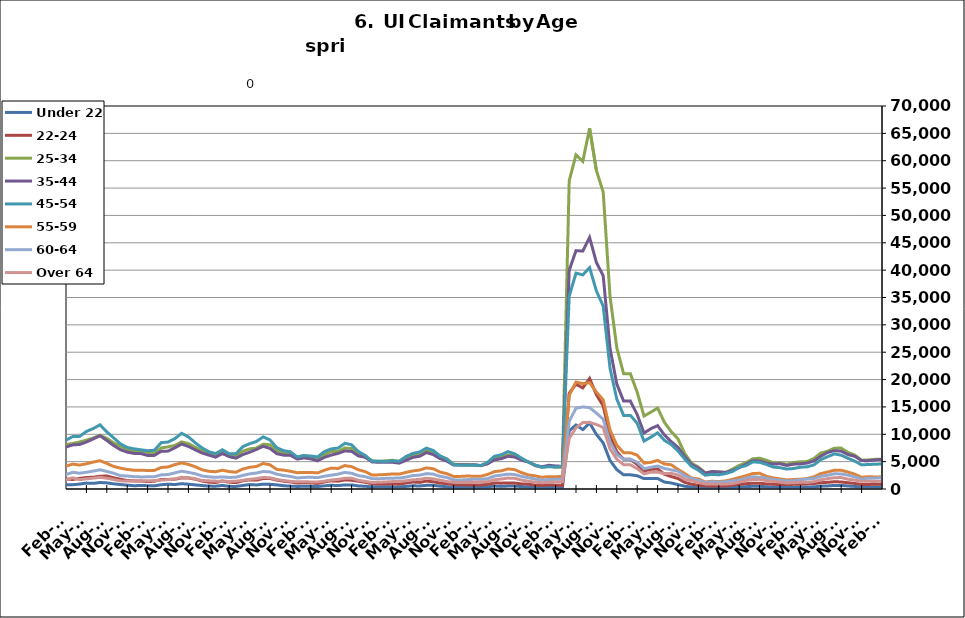
| Category | Under 22 | 22-24 | 25-34 | 35-44 | 45-54 | 55-59 | 60-64 | Over 64 |
|---|---|---|---|---|---|---|---|---|
| 1995-02-28 | 535 | 933 | 5740 | 6206 | 4029 | 1255 | 625 | 276 |
| 1995-03-31 | 534 | 992 | 5856 | 6433 | 4297 | 1294 | 686 | 323 |
| 1995-04-30 | 603 | 1125 | 6814 | 6965 | 4447 | 1392 | 730 | 338 |
| 1995-05-31 | 626 | 1171 | 7442 | 7404 | 4702 | 1383 | 751 | 333 |
| 1995-06-30 | 625 | 1218 | 7514 | 7778 | 4867 | 1435 | 813 | 366 |
| 1995-07-31 | 710 | 1296 | 8612 | 8864 | 5537 | 1595 | 891 | 407 |
| 1995-08-31 | 729 | 1248 | 8185 | 8719 | 5400 | 1604 | 982 | 406 |
| 1995-09-30 | 578 | 1028 | 6615 | 7150 | 4534 | 1351 | 862 | 338 |
| 1995-10-31 | 554 | 957 | 5805 | 6461 | 4159 | 1205 | 741 | 287 |
| 1995-11-30 | 468 | 845 | 5201 | 5826 | 3927 | 1155 | 702 | 254 |
| 1995-12-31 | 517 | 858 | 5350 | 5974 | 4010 | 1153 | 672 | 263 |
| 1996-01-31 | 543 | 927 | 5431 | 6086 | 4208 | 1221 | 685 | 301 |
| 1996-02-29 | 617 | 999 | 5667 | 6535 | 4480 | 1312 | 747 | 305 |
| 1996-03-31 | 622 | 981 | 5896 | 6557 | 4514 | 1362 | 763 | 306 |
| 1996-04-30 | 680 | 1140 | 7032 | 7649 | 5088 | 1527 | 856 | 345 |
| 1996-05-31 | 689 | 1163 | 7220 | 7819 | 5070 | 1521 | 832 | 366 |
| 1996-06-30 | 661 | 1145 | 7344 | 8173 | 5391 | 1568 | 844 | 388 |
| 1996-07-31 | 762 | 1250 | 8375 | 9181 | 6036 | 1755 | 973 | 432 |
| 1996-08-31 | 746 | 1145 | 7829 | 8585 | 5586 | 1651 | 950 | 435 |
| 1996-09-30 | 635 | 992 | 6399 | 7097 | 4790 | 1462 | 804 | 425 |
| 1996-10-31 | 572 | 851 | 5448 | 6291 | 4192 | 1259 | 693 | 340 |
| 1996-11-30 | 531 | 827 | 5003 | 5921 | 3908 | 1153 | 602 | 315 |
| 1996-12-31 | 521 | 789 | 4710 | 5510 | 3673 | 1110 | 610 | 284 |
| 1997-01-31 | 559 | 841 | 5203 | 6172 | 4321 | 1255 | 731 | 328 |
| 1997-02-28 | 556 | 841 | 5187 | 6162 | 4311 | 1250 | 727 | 326 |
| 1997-03-31 | 499 | 806 | 5125 | 6037 | 4176 | 1294 | 702 | 363 |
| 1997-04-30 | 545 | 885 | 5753 | 6709 | 4248 | 1339 | 734 | 339 |
| 1997-05-31 | 612 | 941 | 6146 | 7153 | 4458 | 1348 | 801 | 336 |
| 1997-06-30 | 623 | 995 | 6240 | 7298 | 4662 | 1302 | 776 | 348 |
| 1997-07-31 | 716 | 1154 | 7168 | 8554 | 5489 | 1509 | 903 | 415 |
| 1997-08-31 | 684 | 1072 | 6853 | 8093 | 5222 | 1487 | 837 | 416 |
| 1997-09-30 | 579 | 912 | 5522 | 6592 | 4348 | 1285 | 705 | 380 |
| 1997-10-31 | 516 | 817 | 4894.5 | 5892.5 | 3945 | 1159 | 625 | 344.5 |
| 1997-11-30 | 453 | 722 | 4267 | 5193 | 3542 | 1033 | 545 | 309 |
| 1997-12-31 | 413 | 682 | 3792 | 4755 | 3300 | 1023 | 490 | 266 |
| 1998-01-31 | 489 | 741 | 4044 | 5115 | 3513 | 1099 | 525 | 267 |
| 1998-02-28 | 435 | 684 | 3864 | 4903 | 3549 | 1043 | 571 | 285 |
| 1998-03-31 | 416 | 680 | 3855 | 5086 | 3703 | 1176 | 604 | 297 |
| 1998-04-30 | 592 | 813 | 5092 | 6219 | 4262 | 1336 | 688 | 332 |
| 1998-05-31 | 579 | 849 | 5319 | 6766 | 4554 | 1382 | 729 | 360 |
| 1998-06-30 | 568 | 899 | 5557 | 7101 | 4897 | 1405 | 783 | 367 |
| 1998-07-31 | 691 | 1031 | 6472 | 8095 | 5562 | 1589 | 880 | 392 |
| 1998-08-31 | 673 | 1007 | 6326 | 7950 | 5369 | 1574 | 935 | 393 |
| 1998-09-30 | 548 | 838 | 5206 | 6768 | 4703 | 1432 | 849 | 373 |
| 1998-10-31 | 496 | 776 | 4437 | 5582 | 3875 | 1250 | 711 | 302 |
| 1998-11-30 | 456 | 761 | 4182 | 5332 | 4015 | 1296 | 694 | 308 |
| 1998-12-31 | 442 | 722 | 4010 | 5198 | 4062 | 1331 | 656 | 290 |
| 1999-01-31 | 503 | 830 | 4502 | 5761 | 4521 | 1490 | 751 | 297 |
| 1999-02-28 | 463 | 756 | 4267 | 5576 | 4431 | 1470 | 767 | 301 |
| 1999-03-31 | 435 | 688 | 4119 | 5519 | 4403 | 1516 | 765 | 331 |
| 1999-04-30 | 591 | 949 | 5292 | 7089 | 5468 | 1724 | 914 | 489 |
| 1999-05-31 | 674 | 911 | 5611 | 7459 | 5457 | 1710 | 934 | 500 |
| 1999-06-30 | 640 | 906 | 5660 | 7503 | 5333 | 1695 | 920 | 495 |
| 1999-07-31 | 766 | 1132 | 6820 | 9256 | 6620 | 1981 | 1001 | 549 |
| 1999-08-31 | 738 | 1117 | 6737 | 9030 | 6670 | 2019 | 1075 | 582 |
| 1999-09-30 | 600 | 968 | 5167 | 7169 | 5458 | 1712 | 892 | 465 |
| 1999-10-31 | 494 | 813 | 4501 | 6048 | 4682 | 1443 | 743 | 363 |
| 1999-11-30 | 464 | 768 | 4228 | 5593 | 4564 | 1392 | 702 | 313 |
| 1999-12-31 | 468.5 | 754.5 | 4149 | 5486.5 | 4505 | 1429 | 673 | 304 |
| 2000-01-31 | 473 | 741 | 4070 | 5380 | 4446 | 1466 | 644 | 295 |
| 2000-02-29 | 460 | 691 | 3807 | 5357 | 4470 | 1469 | 707 | 310 |
| 2000-03-31 | 412 | 652 | 3864 | 5499 | 4568 | 1508 | 816 | 389 |
| 2000-04-30 | 585 | 829 | 4741 | 6891 | 5127 | 1631 | 906 | 451 |
| 2000-05-31 | 627 | 875 | 5086 | 7211 | 5238 | 1598 | 956 | 489 |
| 2000-06-30 | 675 | 983 | 5624 | 7826 | 5562 | 1669 | 941 | 524 |
| 2000-07-31 | 802 | 1109 | 6475 | 9102 | 6450 | 1927 | 1097 | 594 |
| 2000-08-31 | 787 | 1058 | 6045 | 8732 | 6157 | 1894 | 1085 | 616 |
| 2000-09-30 | 607 | 897 | 4766 | 6864 | 5037 | 1486 | 902 | 479 |
| 2000-10-31 | 544 | 760 | 4267 | 5897 | 4465 | 1323 | 762 | 394 |
| 2000-11-30 | 535 | 797 | 3982 | 5439 | 4318 | 1256 | 702 | 396 |
| 2000-12-31 | 508 | 832 | 3891 | 5255 | 4218 | 1246 | 694 | 361 |
| 2001-01-31 | 627 | 892 | 4229 | 5724 | 4777 | 1300 | 721 | 393 |
| 2001-02-28 | 643 | 934 | 4553 | 6302 | 5224 | 1529 | 849 | 472 |
| 2001-03-31 | 412 | 648 | 3625 | 5081 | 4551 | 1413 | 778 | 440 |
| 2001-04-30 | 875 | 1276 | 6577 | 8914 | 7196 | 2144 | 1185 | 639 |
| 2001-05-31 | 944 | 1399 | 7133 | 9570 | 7651 | 2265 | 1231 | 679 |
| 2001-06-30 | 1041 | 1584 | 8072 | 11034 | 8621 | 2613 | 1398 | 756 |
| 2001-07-31 | 1135 | 1806 | 9038 | 12514 | 9691 | 2970 | 1611 | 848 |
| 2001-08-31 | 1116 | 1776 | 8753 | 12045 | 9560 | 2963 | 1691 | 898 |
| 2001-09-30 | 1046 | 1705 | 8118 | 11025 | 8788 | 2784 | 1608 | 833 |
| 2001-10-31 | 1094 | 1785 | 8459 | 11114 | 8850 | 2772 | 1610 | 777 |
| 2001-11-30 | 1154 | 1931 | 9131 | 11576 | 9447 | 2973 | 1661 | 778 |
| 2001-12-31 | 1280 | 2191 | 9917 | 11961 | 9905 | 3152 | 1740 | 780 |
| 2002-01-31 | 1330 | 2255 | 10364 | 12730 | 10592 | 3378 | 1843 | 821 |
| 2002-02-28 | 1347 | 2339 | 10349 | 12730 | 10784 | 3499 | 1861 | 867 |
| 2002-03-31 | 1266 | 2231 | 9963 | 12747 | 10614 | 3499 | 1867 | 979 |
| 2002-04-30 | 1412 | 2488 | 11603 | 15825 | 13571 | 4631 | 2389 | 1146 |
| 2002-05-31 | 1455 | 2421 | 11243 | 15509 | 13148 | 4374 | 2359 | 1195 |
| 2002-06-30 | 1534 | 2479 | 11416 | 15594 | 13261 | 4343 | 2365 | 1180 |
| 2002-07-31 | 1513 | 2614 | 11895 | 16242 | 13727 | 4439 | 2428 | 1255 |
| 2002-08-31 | 1022 | 1977 | 8719 | 12054 | 10588 | 3454 | 1990 | 1047 |
| 2002-09-30 | 1391 | 2528 | 10478 | 14010 | 12008 | 3847 | 2161 | 1166 |
| 2002-10-31 | 1401 | 2385 | 9826 | 12727 | 10778 | 3498 | 1886 | 973 |
| 2002-11-30 | 1344 | 2390 | 9846 | 12059 | 10297 | 3367 | 1833 | 958 |
| 2002-12-31 | 1311 | 2403 | 9841 | 11670 | 10177 | 3369 | 1871 | 894 |
| 2003-01-31 | 1311 | 2403 | 9841 | 11670 | 10177 | 3369 | 1871 | 894 |
| 2003-02-28 | 1367 | 2275 | 9730 | 12433 | 10806 | 3687 | 2016 | 974 |
| 2003-03-31 | 1367 | 2357 | 9844 | 12620 | 11167 | 3825 | 2151 | 1094 |
| 2003-04-30 | 1549 | 2525 | 10619 | 14142 | 12182 | 4004 | 2304 | 1190 |
| 2003-05-31 | 1663 | 2698 | 10843 | 14795 | 12539 | 4102 | 2395 | 1256 |
| 2003-06-30 | 1755 | 2770 | 11350 | 15575 | 13251 | 4301 | 2493 | 1325 |
| 2003-07-31 | 1748 | 2791 | 11577 | 15863 | 13772 | 4465 | 2593 | 1371 |
| 2003-08-31 | 1718 | 2653 | 10998 | 15261 | 13219 | 4325 | 2522 | 1359 |
| 2003-09-30 | 1494 | 2521 | 10071 | 13565 | 11659 | 3828 | 2278 | 1286 |
| 2003-10-31 | 1329 | 2432 | 9388 | 12107 | 10693 | 3567 | 2036 | 1129 |
| 2003-11-30 | 1191 | 2226 | 8954 | 11297 | 10037 | 3414 | 2004 | 1068 |
| 2003-12-31 | 1206 | 2184 | 8530 | 10413 | 9335 | 3215 | 1854 | 994 |
| 2004-01-31 | 1216 | 2171 | 8382 | 9858 | 8955 | 2992 | 1736 | 963 |
| 2004-02-29 | 1118 | 1879 | 7614 | 8935 | 8176 | 2761 | 1617 | 943 |
| 2004-03-31 | 1099 | 1749 | 7152 | 8565 | 7769 | 2686 | 1608 | 981 |
| 2004-04-30 | 1241 | 1951 | 7653 | 9981 | 8741 | 2872 | 1685 | 1056 |
| 2004-05-31 | 1245 | 1934 | 7651 | 10203 | 8820 | 2928 | 1703 | 1079 |
| 2004-06-30 | 1316 | 2086 | 8172 | 10636 | 9362 | 3146 | 1843 | 1081 |
| 2004-07-31 | 1476 | 2265 | 8795 | 11511 | 10439 | 3497 | 2008 | 1171 |
| 2004-08-31 | 1390 | 2055 | 8008 | 10418 | 9514 | 3304 | 1909 | 1105 |
| 2004-09-30 | 1129 | 1820 | 6987 | 8661 | 7694 | 2755 | 1623 | 1046 |
| 2004-10-31 | 1037 | 1675 | 6590 | 7964 | 7029 | 2459 | 1461 | 882 |
| 2004-11-30 | 954 | 1638 | 6342 | 7570 | 6733 | 2294 | 1383 | 841 |
| 2004-12-31 | 857 | 1533 | 5921 | 6991 | 6333 | 2225 | 1287 | 764 |
| 2005-01-31 | 893 | 1539 | 6047 | 7410 | 6682 | 2253 | 1274 | 788 |
| 2005-02-28 | 846 | 1361 | 5650 | 6952 | 6404 | 2198 | 1326 | 786 |
| 2005-03-31 | 747 | 1258 | 5313 | 6595 | 6251 | 2151 | 1327 | 742 |
| 2005-04-30 | 877 | 1375 | 5696 | 7717 | 7230 | 2440 | 1401 | 844 |
| 2005-05-31 | 854 | 1408 | 5674 | 7905 | 7454 | 2482 | 1453 | 858 |
| 2005-06-30 | 819 | 1444 | 6028 | 8565 | 7899 | 2613 | 1547 | 890 |
| 2005-07-31 | 900 | 1461 | 6395 | 9124 | 8614 | 2864 | 1640 | 1004 |
| 2005-08-31 | 805 | 1439 | 5917 | 8271 | 8076 | 2692 | 1587 | 945 |
| 2005-09-30 | 631 | 1209 | 4978 | 6413 | 6203 | 2116 | 1312 | 724 |
| 2005-10-31 | 638 | 1134 | 4602 | 6028 | 5688 | 1997 | 1171 | 656 |
| 2005-11-30 | 564 | 1071 | 4409 | 5563 | 5105 | 1791 | 1035 | 580 |
| 2005-12-31 | 523 | 987 | 4014 | 4983 | 4531 | 1673 | 968 | 546 |
| 2006-01-31 | 531 | 925 | 3900 | 5012 | 4793 | 1691 | 1008 | 539 |
| 2006-02-28 | 447 | 804 | 3534 | 4388 | 4403 | 1586 | 980 | 549 |
| 2006-03-31 | 399 | 785 | 3455 | 4472 | 4584 | 1680 | 1069 | 618 |
| 2006-04-30 | 527 | 945 | 4004 | 5859 | 5921 | 1965 | 1251 | 744 |
| 2006-05-31 | 594 | 964 | 4205 | 6365 | 6369 | 2156 | 1327 | 792 |
| 2006-06-30 | 660 | 1113 | 4742 | 7052 | 7094 | 2386 | 1474 | 933 |
| 2006-07-31 | 771 | 1183 | 5214 | 7974 | 8007 | 2685 | 1635 | 1072 |
| 2006-08-31 | 737 | 1202 | 5116 | 7524 | 7553 | 2671 | 1590 | 1019 |
| 2006-09-30 | 596 | 1086 | 4608 | 6175 | 6389 | 2256 | 1287 | 812 |
| 2006-10-31 | 596 | 1056 | 4585 | 5758 | 5788 | 2026 | 1164 | 696 |
| 2006-11-30 | 542 | 1003 | 4370 | 5304 | 5388 | 1812 | 1082 | 604 |
| 2006-12-31 | 553 | 1102 | 4425 | 5291 | 5310 | 1801 | 1099 | 603 |
| 2007-01-31 | 587 | 1147 | 4542 | 5619 | 5506 | 1920 | 1174 | 663 |
| 2007-02-28 | 544 | 1090 | 4490 | 5562 | 5616 | 1982 | 1260 | 705 |
| 2007-03-31 | 558 | 1089 | 4498 | 5595 | 5708 | 2016 | 1378 | 717 |
| 2007-04-30 | 760 | 1203 | 5015 | 6827 | 6871 | 2316 | 1536 | 856 |
| 2007-05-31 | 806 | 1285 | 5542 | 7679 | 7763 | 2571 | 1719 | 1021 |
| 2007-06-30 | 862 | 1340 | 6100 | 8324 | 8341 | 2812 | 1896 | 1060 |
| 2007-07-31 | 980 | 1524 | 6616 | 9184 | 9522 | 3226 | 2038 | 1250 |
| 2007-08-31 | 950 | 1510 | 6266 | 8359 | 8842 | 3033 | 1949 | 1157 |
| 2007-09-30 | 865 | 1595 | 6213 | 7798 | 7957 | 2790 | 1816 | 1090 |
| 2007-10-31 | 883 | 1517 | 6214 | 7229 | 7503 | 2574 | 1630 | 978 |
| 2007-11-15 | 816 | 1424 | 5981 | 6740 | 6999 | 2468 | 1510 | 860 |
| 2007-12-15 09:36:00 | 851 | 1536 | 6411 | 6986 | 7174 | 2572 | 1584 | 874 |
| 2008-01-14 19:12:00 | 963 | 1628 | 6836 | 7533 | 7742 | 2786 | 1744 | 940 |
| 2008-02-14 04:48:00 | 982 | 1565 | 6847 | 7767 | 8031 | 2958 | 1823 | 985 |
| 2008-03-15 14:24:00 | 1029 | 1666 | 7210 | 8036 | 8353 | 3105 | 1898 | 1085 |
| 2008-04-15 | 1182 | 1889 | 7894 | 9339 | 9822 | 3537 | 2184 | 1246 |
| 2008-05-15 09:36:00 | 1325 | 2099 | 8651 | 10315 | 11003 | 3871 | 2423 | 1448 |
| 2008-06-14 19:12:00 | 1405 | 2238 | 9567 | 11330 | 12040 | 4322 | 2650 | 1572 |
| 2008-07-15 04:48:00 | 1616 | 2488 | 10336 | 12349 | 13396 | 4698 | 3083 | 1801 |
| 2008-08-14 14:24:00 | 1753 | 2665 | 10716 | 12486 | 13444 | 4795 | 3139 | 1802 |
| 2008-09-14 | 1800 | 2924 | 11552 | 12686 | 13602 | 4801 | 3180 | 1811 |
| 2008-10-14 09:36:00 | 1936 | 3131 | 12284 | 13322 | 13831 | 4989 | 3183 | 1808 |
| 2008-11-13 19:12:00 | 2093 | 3414 | 13577 | 14724 | 15130 | 5413 | 3440 | 1946 |
| 2008-12-14 04:48:00 | 2495 | 4020 | 15380 | 16325 | 16846 | 6098 | 3755 | 2155 |
| 2009-01-13 14:24:00 | 3054 | 4678 | 17678 | 18452 | 19095 | 6788 | 4182 | 2364 |
| 2009-02-13 | 3531 | 5304 | 19793 | 20788 | 21601 | 7727 | 4836 | 2718 |
| 2009-03-15 09:36:00 | 3891 | 5925 | 22303 | 23139 | 24352 | 8876 | 5515 | 3141 |
| 2009-04-14 19:12:00 | 4291 | 6403 | 23925 | 25362 | 26817 | 9618 | 6020 | 3494 |
| 2009-05-15 04:48:00 | 4410 | 6521 | 24301 | 25794 | 27238 | 9735 | 6181 | 3529 |
| 2009-06-14 14:24:00 | 4405 | 6853 | 25234 | 26806 | 28296 | 10256 | 6673 | 3804 |
| 2009-07-15 | 4729 | 7280 | 26132 | 27836 | 29724 | 10830 | 6950 | 4125 |
| 2009-08-14 09:36:00 | 4717 | 7069 | 25281 | 26184 | 27877 | 10164 | 6719 | 3918 |
| 2009-09-13 19:12:00 | 4741 | 7291 | 25029 | 24981 | 26018 | 9679 | 6210 | 3594 |
| 2009-10-14 04:48:00 | 4656 | 7051 | 24241 | 23779 | 24730 | 9034 | 5817 | 3422 |
| 2009-11-13 14:24:00 | 4421 | 6817 | 23760 | 22851 | 23515 | 8627 | 5549 | 3297 |
| 2009-12-14 | 4232 | 6586 | 23118 | 22038 | 22501 | 8496 | 5370 | 3295 |
| 2010-01-13 09:36:00 | 4276 | 6583 | 22706 | 21421 | 22132 | 8135 | 5154 | 3134 |
| 2010-02-12 19:12:00 | 4133 | 6142 | 21386 | 20012 | 21036 | 7728 | 5039 | 3047 |
| 2010-03-15 04:48:00 | 3784 | 5822 | 20418 | 19073 | 20556 | 7446 | 4983 | 3062 |
| 2010-04-14 14:24:00 | 3731 | 5751 | 20058 | 19261 | 21012 | 7449 | 5078 | 2936 |
| 2010-05-15 | 3516 | 5553 | 19393 | 18793 | 20409 | 7213 | 4923 | 2915 |
| 2010-06-14 09:36:00 | 3450 | 5640 | 19615 | 19385 | 20781 | 7547 | 5293 | 3043 |
| 2010-07-14 19:12:00 | 3536 | 5781 | 19820 | 19714 | 21269 | 7946 | 5439 | 3330 |
| 2010-08-14 04:48:00 | 3477 | 5590 | 18902 | 18548 | 19686 | 7561 | 5039 | 3181 |
| 2010-09-13 14:24:00 | 3083 | 5332 | 17344 | 16712 | 17408 | 6775 | 4612 | 2859 |
| 2010-10-14 | 3004 | 5138 | 17187 | 16492 | 17042 | 6713 | 4418 | 2779 |
| 2010-11-13 09:36:00 | 2724 | 4771 | 16387 | 15438 | 16061 | 6360 | 4209 | 2601 |
| 2010-12-13 19:12:00 | 2335 | 4159 | 15175 | 14143 | 14646 | 5823 | 4003 | 2480 |
| 2011-01-13 04:48:00 | 2530 | 4343 | 15492 | 14596 | 15561 | 6250 | 4059 | 2487 |
| 2011-02-12 14:24:00 | 2609 | 4202 | 15131 | 14142 | 15320 | 6044 | 4041 | 2517 |
| 2011-03-15 | 2290 | 3998 | 14370 | 13505 | 14523 | 5925 | 3990 | 2470 |
| 2011-04-14 09:36:00 | 2563 | 4190 | 14834 | 14445 | 15508 | 6130 | 3916 | 2488 |
| 2011-05-14 19:12:00 | 2642 | 4217 | 14917 | 14494 | 16051 | 6156 | 4129 | 2602 |
| 2011-06-14 04:48:00 | 2767 | 4676 | 17673 | 17404 | 19563 | 7763 | 5398 | 3653 |
| 2011-07-14 14:24:00 | 3027 | 4815 | 17530 | 17197 | 19880 | 7870 | 5384 | 3686 |
| 2011-08-14 | 2900 | 4498 | 15970 | 15020 | 17035 | 6697 | 4394 | 2956 |
| 2011-09-13 09:36:00 | 2531 | 4156 | 14609 | 13818 | 15092 | 5903 | 3881 | 2687 |
| 2011-10-13 19:12:00 | 2452 | 3959 | 14501 | 13415 | 14565 | 5635 | 3734 | 2491 |
| 2011-11-13 04:48:00 | 2197 | 3615 | 13732 | 12410 | 13698 | 5345 | 3574 | 2339 |
| 2011-12-13 14:24:00 | 1938 | 3290 | 13130 | 11646 | 13054 | 5089 | 3380 | 2177 |
| 2012-01-13 | 2098 | 3424 | 13293 | 11897 | 13400 | 5218 | 3448 | 2197 |
| 2012-02-12 09:36:00 | 2047 | 3428 | 12569 | 11400 | 12931 | 5177 | 3445 | 2212 |
| 2012-03-13 19:12:00 | 1870 | 3252 | 11913 | 10922 | 12476 | 4948 | 3317 | 2155 |
| 2012-04-13 04:48:00 | 2063 | 3590 | 12479 | 11814 | 13464 | 5278 | 3509 | 2287 |
| 2012-05-13 14:24:00 | 2260 | 3828 | 12852 | 12063 | 14139 | 5562 | 3628 | 2485 |
| 2012-06-13 | 2147 | 3747 | 13008 | 12659 | 14694 | 5791 | 3902 | 2736 |
| 2012-07-13 09:36:00 | 2358 | 4087 | 14109 | 13412 | 15770 | 6346 | 4156 | 3086 |
| 2012-08-12 19:12:00 | 1887 | 3284 | 11852 | 11102 | 13153 | 5396 | 3487 | 2583 |
| 2012-09-12 04:48:00 | 1524 | 2903 | 10742 | 10051 | 11393 | 4726 | 3103 | 2327 |
| 2012-10-12 14:24:00 | 1289 | 2603 | 10123 | 9339 | 10510 | 4405 | 2813 | 2032 |
| 2012-11-12 | 945 | 2155 | 8870 | 8273 | 9193 | 3781 | 2520 | 1702 |
| 2012-12-12 09:36:00 | 937 | 2201 | 8913 | 8210 | 9124 | 3816 | 2491 | 1722 |
| 2013-01-11 19:12:00 | 934 | 2199 | 9132 | 8579 | 9635 | 4095 | 2569 | 1667 |
| 2013-02-11 04:48:00 | 915 | 1996 | 8343 | 8072 | 9253 | 4034 | 2623 | 1715 |
| 2013-03-13 14:24:00 | 845 | 1934 | 8092 | 7955 | 9007 | 3929 | 2561 | 1667 |
| 2013-04-13 | 1055 | 2124 | 8637 | 8445 | 9891 | 4204 | 2666 | 1698 |
| 2013-05-13 09:36:00 | 1160 | 2394 | 9413 | 8898 | 10920 | 4574 | 2940 | 1871 |
| 2013-06-12 19:12:00 | 1145 | 2351 | 9732 | 9510 | 11293 | 4830 | 3115 | 1976 |
| 2013-07-13 04:48:00 | 1294 | 2558 | 10421 | 10174 | 12520 | 5363 | 3434 | 2233 |
| 2013-08-12 14:24:00 | 1238 | 2519 | 10150 | 9771 | 11886 | 5067 | 3372 | 2140 |
| 2013-09-12 | 1116 | 2214 | 9323 | 8874 | 10178 | 4389 | 2964 | 1871 |
| 2013-10-12 09:36:00 | 1000 | 2044 | 8893 | 8509 | 9449 | 4200 | 2701 | 1709 |
| 2013-11-11 19:12:00 | 842 | 1927 | 8532 | 8049 | 8950 | 4028 | 2665 | 1675 |
| 2013-12-12 04:48:00 | 753 | 1854 | 8098 | 7692 | 8612 | 3913 | 2557 | 1655 |
| 2014-01-11 14:24:00 | 788 | 1846 | 8270 | 7762 | 8786 | 4128 | 2606 | 1642 |
| 2014-02-11 | 795 | 1817 | 8124 | 7677 | 8944 | 4189 | 2646 | 1728 |
| 2014-03-13 09:36:00 | 782 | 1741 | 8319 | 8063 | 9583 | 4550 | 3048 | 2040 |
| 2014-04-12 19:12:00 | 905 | 1940 | 8594 | 8138 | 9620 | 4372 | 2886 | 1706 |
| 2014-05-13 04:48:00 | 1079 | 2093 | 8933 | 8593 | 10522 | 4609 | 3062 | 1850 |
| 2014-06-12 14:24:00 | 1028 | 2152 | 9323 | 9148 | 11040 | 4920 | 3274 | 1985 |
| 2014-07-13 | 1189 | 2333 | 9808 | 9735 | 11729 | 5171 | 3509 | 2133 |
| 2014-08-14 | 1119 | 2379 | 9259 | 8876 | 10438 | 4678 | 3210 | 1962 |
| 2014-09-13 09:36:00 | 943 | 2048 | 8430 | 7946 | 9358 | 4119 | 2891 | 1734 |
| 2014-10-13 19:12:00 | 816 | 1781 | 7821 | 7185 | 8244 | 3813 | 2437 | 1486 |
| 2014-11-13 04:48:00 | 703 | 1557 | 7150 | 6736 | 7594 | 3571 | 2374 | 1466 |
| 2014-12-13 14:24:00 | 597 | 1482 | 6833 | 6507 | 7340 | 3442 | 2255 | 1458 |
| 2015-01-13 | 646 | 1466 | 6927 | 6477 | 7168 | 3432 | 2210 | 1429 |
| 2015-02-12 09:36:00 | 607 | 1346 | 6696 | 6134 | 6999 | 3383 | 2220 | 1525 |
| 2015-03-14 19:12:00 | 577 | 1416 | 6499 | 6145 | 7077 | 3405 | 2233 | 1530 |
| 2015-04-14 04:48:00 | 784 | 1736 | 7505 | 6901 | 8468 | 3935 | 2586 | 1624 |
| 2015-05-14 14:24:00 | 875 | 1749 | 7696 | 6925 | 8578 | 4020 | 2644 | 1698 |
| 2015-06-14 | 818 | 1789 | 7961 | 7519 | 9200 | 4452 | 2943 | 1839 |
| 2015-07-14 09:36:00 | 966 | 2033 | 8609 | 8223 | 10167 | 4766 | 3254 | 2136 |
| 2015-08-13 19:12:00 | 880 | 2007 | 8302 | 7779 | 9530 | 4503 | 3045 | 2073 |
| 2015-09-13 04:48:00 | 752 | 1807 | 7615 | 7153 | 8455 | 4067 | 2798 | 1870 |
| 2015-10-13 14:24:00 | 630 | 1461 | 6995 | 6578 | 7509 | 3519 | 2375 | 1570 |
| 2015-11-13 | 533 | 1246 | 6491 | 6196 | 6815 | 3237 | 2224 | 1493 |
| 2015-12-13 09:36:00 | 512 | 1179 | 6242 | 5823 | 6474 | 3158 | 2123 | 1439 |
| 2016-01-12 19:12:00 | 646 | 1466 | 6927 | 6477 | 7168 | 3432 | 2210 | 1429 |
| 2016-02-12 04:48:00 | 482 | 1246 | 6101 | 5912 | 6452 | 3180 | 2110 | 1385 |
| 2016-03-13 14:24:00 | 474 | 1170 | 6011 | 5629 | 6452 | 3073 | 2152 | 1420 |
| 2016-04-13 | 648 | 1494 | 6917 | 6287 | 7737 | 3648 | 2483 | 1600 |
| 2016-05-13 09:36:00 | 812 | 1670 | 7326 | 6725 | 8279 | 3967 | 2765 | 1776 |
| 2016-06-12 19:12:00 | 738 | 1622 | 7479 | 7230 | 8681 | 4111 | 2920 | 1886 |
| 2016-07-13 04:48:00 | 875 | 1919 | 8193 | 7814 | 9525 | 4662 | 3196 | 2105 |
| 2016-08-12 14:24:00 | 858 | 1920 | 8091 | 7407 | 8969 | 4420 | 3130 | 2050 |
| 2016-09-12 | 752 | 1632 | 6992 | 6450 | 7548 | 3573 | 2713 | 1747 |
| 2016-10-12 09:36:00 | 602 | 1423 | 6590 | 6190 | 6998 | 3448 | 2457 | 1544 |
| 2016-11-11 19:12:00 | 523 | 1296 | 6418 | 6179 | 6801 | 3241 | 2299 | 1410 |
| 2016-12-12 04:48:00 | 468 | 1096 | 5827 | 5472 | 5867 | 2981 | 2019 | 1311 |
| 2017-01-11 14:24:00 | 495 | 1150 | 6111 | 5679 | 6108 | 3035 | 2115 | 1342 |
| 2017-02-11 | 484 | 1109 | 5882 | 5500 | 6023 | 3023 | 2148 | 1289 |
| 2017-03-13 09:36:00 | 442 | 1015 | 5634 | 5148 | 5865 | 2942 | 2075 | 1278 |
| 2017-04-12 19:12:00 | 585 | 1285 | 6292 | 5783 | 6842 | 3434 | 2336 | 1435 |
| 2017-05-13 04:48:00 | 686 | 1492 | 6844 | 6200 | 7332 | 3817 | 2526 | 1637 |
| 2017-06-12 14:24:00 | 623 | 1435 | 6852 | 6505 | 7473 | 3751 | 2713 | 1754 |
| 2017-07-13 | 745 | 1658 | 7483 | 6953 | 8339 | 4284 | 3038 | 1964 |
| 2017-08-12 09:36:00 | 745 | 1605 | 7411 | 6880 | 8092 | 4080 | 2878 | 1966 |
| 2017-09-11 19:12:00 | 559 | 1420 | 6481 | 6045 | 6845 | 3511 | 2443 | 1591 |
| 2017-10-12 04:48:00 | 503 | 1224 | 5960 | 5790 | 6135 | 3181 | 2245 | 1400 |
| 2017-11-11 14:24:00 | 390 | 972 | 5167 | 4951 | 5077 | 2553 | 1887 | 1188 |
| 2017-12-12 | 413 | 914 | 5058 | 4876 | 5071 | 2585 | 1870 | 1226 |
| 2018-01-11 09:36:00 | 411 | 912 | 5154 | 4909 | 5000 | 2656 | 1952 | 1288 |
| 2018-02-10 19:12:00 | 383 | 940 | 5246 | 4884 | 5165 | 2743 | 1980 | 1355 |
| 2018-03-13 04:48:00 | 373 | 875 | 5018 | 4724 | 5075 | 2723 | 1999 | 1389 |
| 2018-04-12 14:24:00 | 478 | 1104 | 5584 | 5240 | 5944 | 3026 | 2179 | 1506 |
| 2018-05-13 | 586 | 1275 | 6280 | 5780 | 6500 | 3300 | 2452 | 1670 |
| 2018-06-12 09:36:00 | 554 | 1207 | 6302 | 5974 | 6766 | 3462 | 2534 | 1762 |
| 2018-07-12 19:12:00 | 666 | 1445 | 7024 | 6656 | 7473 | 3858 | 2810 | 1989 |
| 2018-08-12 04:48:00 | 671 | 1323 | 6823 | 6293 | 7046 | 3706 | 2722 | 1850 |
| 2018-09-11 14:24:00 | 518 | 1084 | 5965 | 5563 | 6066 | 3091 | 2318 | 1618 |
| 2018-10-12 | 419 | 985 | 5538 | 5106 | 5464 | 2806 | 2102 | 1367 |
| 2018-11-11 09:36:00 | 306 | 808 | 4542 | 4371 | 4433 | 2297 | 1673 | 1222 |
| 2018-12-11 19:12:00 | 328 | 771 | 4439 | 4429 | 4340 | 2303 | 1646 | 1174 |
| 2019-01-11 04:48:00 | 327 | 743 | 4491 | 4378 | 4359 | 2368 | 1715 | 1218 |
| 2019-02-10 14:24:00 | 338 | 739 | 4402 | 4415 | 4345 | 2337 | 1773 | 1237 |
| 2019-03-13 | 306 | 738 | 4246 | 4293 | 4304 | 2328 | 1756 | 1281 |
| 2019-04-12 09:36:00 | 396 | 850 | 4657 | 4603 | 4871 | 2655 | 1900 | 1347 |
| 2019-05-12 19:12:00 | 541 | 1092 | 5700 | 5319 | 5974 | 3169 | 2371 | 1690 |
| 2019-06-12 04:48:00 | 476 | 1070 | 5822 | 5537 | 6262 | 3317 | 2534 | 1820 |
| 2019-07-12 14:24:00 | 538 | 1114 | 6206 | 5980 | 6836 | 3673 | 2717 | 1996 |
| 2019-08-12 | 528 | 1084 | 6044 | 5828 | 6422 | 3535 | 2645 | 1942 |
| 2019-09-11 09:36:00 | 445 | 932 | 5379 | 5275 | 5630 | 2979 | 2299 | 1624 |
| 2019-10-11 19:12:00 | 372 | 877 | 4949 | 4938 | 4922 | 2579 | 2058 | 1418 |
| 2019-11-11 04:48:00 | 332 | 701 | 4242 | 4332 | 4379 | 2392 | 1809 | 1247 |
| 2019-12-11 14:24:00 | 261 | 663 | 3977 | 4071 | 3974 | 2137 | 1619 | 1150 |
| 2020-01-11 | 272 | 724 | 4153 | 4331 | 4085 | 2258 | 1715 | 1206 |
| 2020-02-10 09:36:00 | 274 | 704 | 3992 | 4211 | 4020 | 2226 | 1784 | 1286 |
| 2020-03-11 19:12:00 | 291 | 630 | 3985 | 4153 | 4136 | 2332 | 1794 | 1308 |
| 2020-04-11 04:48:00 | 10628 | 17510 | 56346 | 39970 | 35225 | 17140 | 12379 | 9237 |
| 2020-05-11 14:24:00 | 11700 | 19159 | 61067 | 43562 | 39459 | 19553 | 14765 | 11197 |
| 2020-06-11 | 10859 | 18470 | 59897 | 43484 | 39131 | 19246 | 15000 | 12140 |
| 2020-07-11 09:36:00 | 12066 | 20204 | 65924 | 45983 | 40459 | 19436 | 14870 | 12160 |
| 2020-08-10 19:12:00 | 9989 | 17237 | 58218 | 41395 | 36191 | 17725 | 13875 | 11793 |
| 2020-09-10 04:48:00 | 8425 | 15201 | 54260 | 38988 | 33440 | 16290 | 12758 | 11237 |
| 2020-10-10 14:24:00 | 5224 | 9693 | 35264 | 25722 | 22091 | 10801 | 8611 | 7331 |
| 2020-11-10 | 3533 | 6796 | 25816 | 19183 | 16424 | 8018 | 6314 | 5449 |
| 2020-12-10 09:36:00 | 2593 | 5424 | 21071 | 16063 | 13455 | 6630 | 5449 | 4436 |
| 2021-01-09 19:12:00 | 2593 | 5424 | 21071 | 16063 | 13455 | 6630 | 5449 | 4436 |
| 2021-02-09 04:48:00 | 2420 | 4500 | 17683 | 13595 | 12022 | 6183 | 4899 | 3716 |
| 2021-03-11 14:24:00 | 1905 | 3249 | 13332 | 10225 | 8752 | 4732 | 3708 | 2781 |
| 2021-04-11 | 1938 | 3581 | 14034 | 11018 | 9457 | 4873 | 3962 | 3063 |
| 2021-05-11 09:36:00 | 1918 | 3672 | 14797 | 11584 | 10265 | 5238 | 4196 | 3085 |
| 2021-06-10 19:12:00 | 1277 | 2699 | 12194 | 9866 | 8892 | 4577 | 3756 | 2811 |
| 2021-07-11 04:48:00 | 1101 | 2270 | 10491 | 8653 | 8141 | 4427 | 3493 | 2859 |
| 2021-08-10 14:24:00 | 802 | 1912 | 9154 | 7615 | 6945 | 3597 | 3259 | 2545 |
| 2021-09-10 | 499 | 1209 | 6458 | 5895 | 5459 | 2812 | 2399 | 1777 |
| 2021-10-10 09:36:00 | 363 | 875 | 4718 | 4474 | 4141 | 2009 | 1903 | 1513 |
| 2021-11-09 19:12:00 | 251 | 681 | 3999 | 3834 | 3423 | 1835 | 1611 | 1206 |
| 2021-12-10 04:48:00 | 194 | 580 | 2968 | 2881 | 2517 | 1278 | 1152 | 925 |
| 2022-01-09 14:24:00 | 189 | 547 | 3143 | 3194 | 2678 | 1410 | 1338 | 928 |
| 2022-02-09 | 183 | 575 | 3165 | 3086 | 2590 | 1357 | 1270 | 874 |
| 2022-03-11 09:36:00 | 219 | 541 | 2988 | 3043 | 2829 | 1476 | 1313 | 912 |
| 2022-04-10 19:12:00 | 308 | 723 | 3641 | 3357 | 3189 | 1758 | 1482 | 986 |
| 2022-05-11 04:48:00 | 365 | 837 | 4299 | 3915 | 3953 | 2098 | 1624 | 1241 |
| 2022-06-10 14:24:00 | 427 | 969 | 4818 | 4519 | 4269 | 2418 | 1965 | 1563 |
| 2022-07-11 | 494 | 1055 | 5515 | 5179 | 4951 | 2831 | 2235 | 1736 |
| 2022-08-10 09:36:00 | 499 | 1062 | 5638 | 5140 | 4881 | 2872 | 2150 | 1763 |
| 2022-09-09 19:12:00 | 403 | 928 | 5254 | 4761 | 4495 | 2315 | 1987 | 1537 |
| 2022-10-10 04:48:00 | 356 | 870 | 4804 | 4541 | 4005 | 2021 | 1701 | 1388 |
| 2022-11-09 14:24:00 | 318 | 806 | 4749 | 4616 | 3897 | 1850 | 1634 | 1258 |
| 2022-12-10 | 316 | 798 | 4526 | 4305 | 3649 | 1660 | 1473 | 1109 |
| 2023-01-09 09:36:00 | 354 | 854 | 4842 | 4537 | 3747 | 1738 | 1502 | 1138 |
| 2023-02-08 19:12:00 | 380 | 900 | 4985 | 4592 | 3982 | 1792 | 1697 | 1241 |
| 2023-03-11 04:48:00 | 343 | 933 | 5009 | 4742 | 4059 | 1913 | 1812 | 1202 |
| 2023-04-10 14:24:00 | 399 | 1000 | 5597 | 5128 | 4410 | 2234 | 1914 | 1340 |
| 2023-05-11 | 516 | 1142 | 6568 | 5996 | 5370 | 2815 | 2322 | 1685 |
| 2023-06-10 09:36:00 | 557 | 1222 | 6899 | 6670 | 5910 | 3107 | 2509 | 1893 |
| 2023-07-10 19:12:00 | 656 | 1326 | 7469 | 7009 | 6415 | 3420 | 2775 | 2064 |
| 2023-08-10 04:48:00 | 654 | 1288 | 7473 | 6920 | 6181 | 3422 | 2756 | 2088 |
| 2023-09-09 14:24:00 | 548 | 1140 | 6670 | 6288 | 5609 | 3096 | 2527 | 1783 |
| 2023-10-10 | 472 | 1012 | 6205 | 5964 | 5087 | 2705 | 2199 | 1626 |
| 2023-11-09 09:36:00 | 356 | 814 | 5261 | 5187 | 4411 | 2146 | 1821 | 1415 |
| 2023-12-09 19:12:00 | 343 | 834 | 5324 | 5183 | 4479 | 2246 | 1976 | 1410 |
| 2024-01-09 04:48:00 | 392 | 875 | 5427 | 5298 | 4524 | 2201 | 1981 | 1374 |
| 2024-02-08 14:24:00 | 362 | 880 | 5434 | 5435 | 4573 | 2225 | 2100 | 1448 |